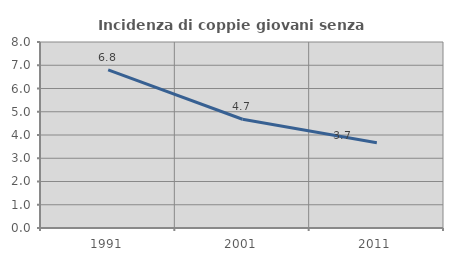
| Category | Incidenza di coppie giovani senza figli |
|---|---|
| 1991.0 | 6.799 |
| 2001.0 | 4.678 |
| 2011.0 | 3.67 |